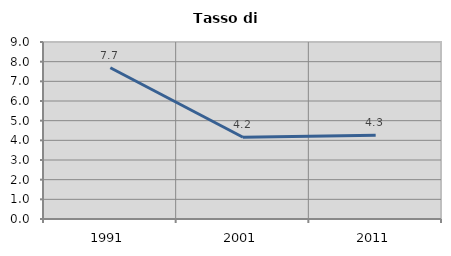
| Category | Tasso di disoccupazione   |
|---|---|
| 1991.0 | 7.692 |
| 2001.0 | 4.156 |
| 2011.0 | 4.264 |